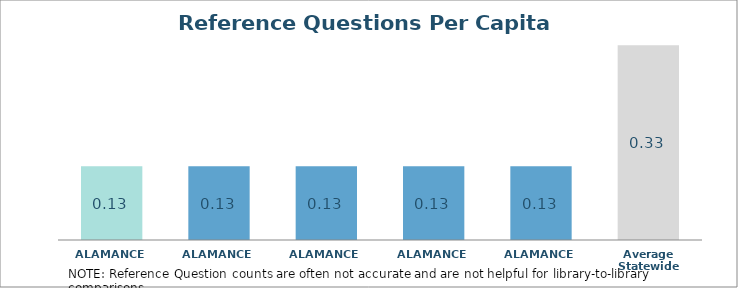
| Category | Series 0 |
|---|---|
| ALAMANCE  | 0.126 |
| ALAMANCE  | 0.126 |
| ALAMANCE  | 0.126 |
| ALAMANCE  | 0.126 |
| ALAMANCE  | 0.126 |
| Average Statewide | 0.332 |